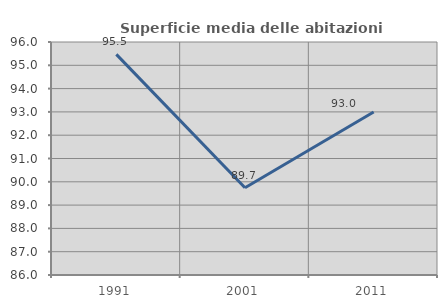
| Category | Superficie media delle abitazioni occupate |
|---|---|
| 1991.0 | 95.468 |
| 2001.0 | 89.742 |
| 2011.0 | 92.998 |